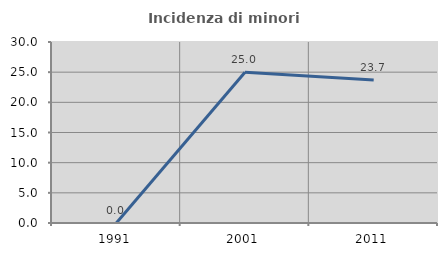
| Category | Incidenza di minori stranieri |
|---|---|
| 1991.0 | 0 |
| 2001.0 | 25 |
| 2011.0 | 23.684 |